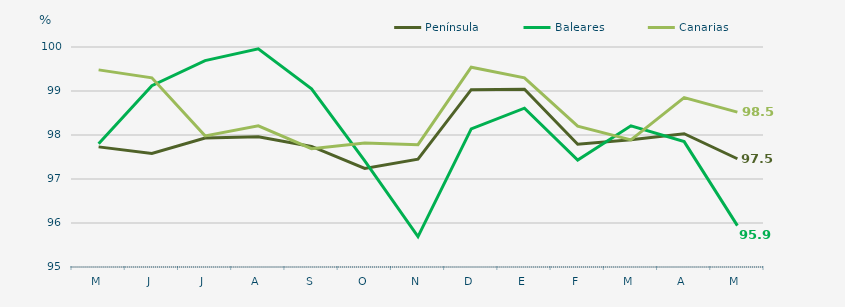
| Category | Península | Baleares | Canarias |
|---|---|---|---|
| M | 97.73 | 97.8 | 99.48 |
| J | 97.58 | 99.12 | 99.3 |
| J | 97.93 | 99.69 | 97.98 |
| A | 97.96 | 99.96 | 98.21 |
| S | 97.74 | 99.05 | 97.69 |
| O | 97.24 | 97.41 | 97.82 |
| N | 97.45 | 95.69 | 97.78 |
| D | 99.03 | 98.14 | 99.54 |
| E | 99.04 | 98.61 | 99.3 |
| F | 97.79 | 97.43 | 98.2 |
| M | 97.89 | 98.21 | 97.89 |
| A | 98.03 | 97.85 | 98.85 |
| M | 97.46 | 95.94 | 98.52 |